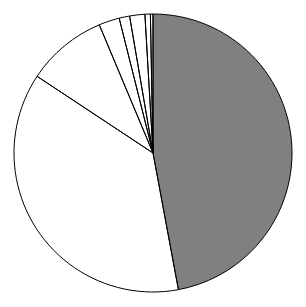
| Category | Series 0 |
|---|---|
| 0 | 47.113 |
| 1 | 37.26 |
| 2 | 9.393 |
| 3 | 2.403 |
| 4 | 1.219 |
| 5 | 1.769 |
| 6 | 0.63 |
| 7 | 0.3 |